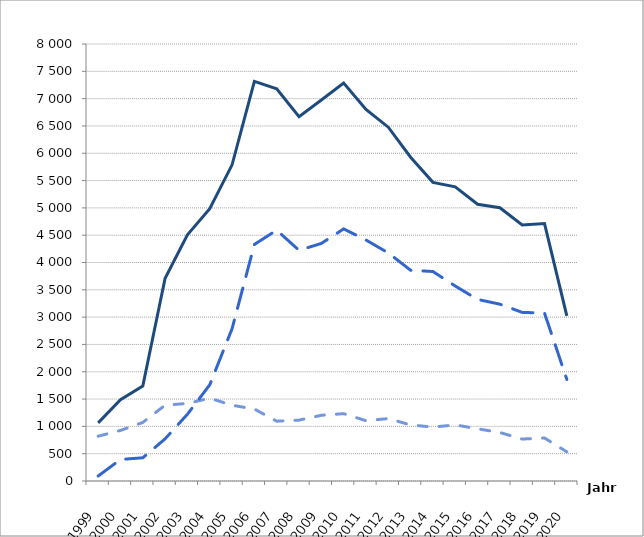
| Category | insgesamt | Unternehmen | Verbraucher:innen |
|---|---|---|---|
| 1999.0 | 1064 | 820 | 91 |
| 2000.0 | 1488 | 926 | 394 |
| 2001.0 | 1737 | 1072 | 425 |
| 2002.0 | 3712 | 1388 | 772 |
| 2003.0 | 4507 | 1420 | 1222 |
| 2004.0 | 4984 | 1516 | 1761 |
| 2005.0 | 5788 | 1387 | 2788 |
| 2006.0 | 7315 | 1317 | 4330 |
| 2007.0 | 7181 | 1095 | 4592 |
| 2008.0 | 6671 | 1114 | 4223 |
| 2009.0 | 6976 | 1203 | 4349 |
| 2010.0 | 7287 | 1233 | 4615 |
| 2011.0 | 6803 | 1104 | 4412 |
| 2012.0 | 6477 | 1143 | 4175 |
| 2013.0 | 5928 | 1026 | 3858 |
| 2014.0 | 5467 | 987 | 3835 |
| 2015.0 | 5384 | 1027 | 3569 |
| 2016.0 | 5067 | 956 | 3324 |
| 2017.0 | 5003 | 888 | 3237 |
| 2018.0 | 4688 | 768 | 3087 |
| 2019.0 | 4713 | 787 | 3073 |
| 2020.0 | 3024 | 534 | 1859 |